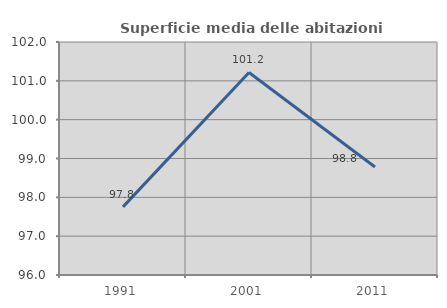
| Category | Superficie media delle abitazioni occupate |
|---|---|
| 1991.0 | 97.754 |
| 2001.0 | 101.216 |
| 2011.0 | 98.783 |